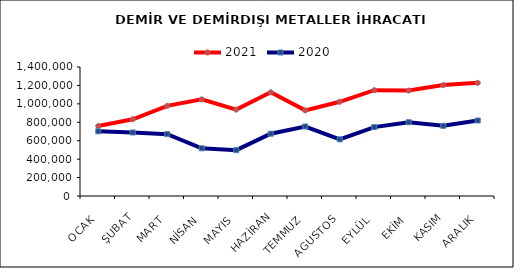
| Category | 2021 | 2020 |
|---|---|---|
| OCAK | 758807.657 | 702065.383 |
| ŞUBAT | 832971.49 | 689342.322 |
| MART | 978714.784 | 671242.555 |
| NİSAN | 1048757.346 | 517649.661 |
| MAYIS | 937393.493 | 497664.981 |
| HAZİRAN | 1125489.379 | 676090.305 |
| TEMMUZ | 929227.417 | 754121.441 |
| AGUSTOS | 1022537.712 | 614882.815 |
| EYLÜL | 1147967.796 | 747564.971 |
| EKİM | 1143920.463 | 800756.087 |
| KASIM | 1203722.126 | 761575.417 |
| ARALIK | 1227940.303 | 819266.599 |